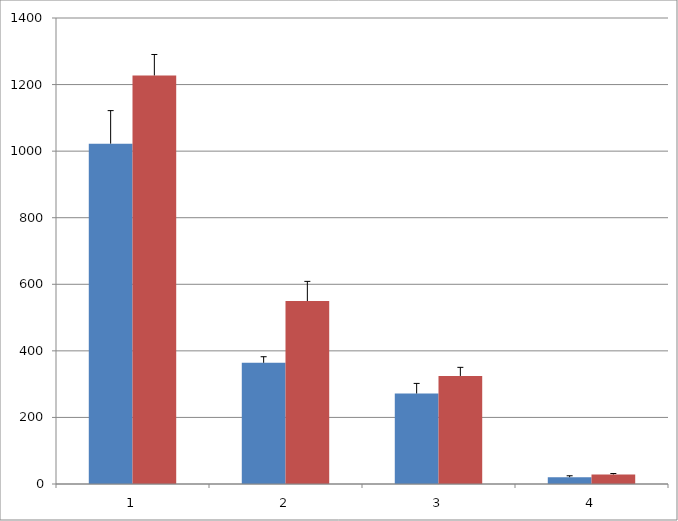
| Category | Series 0 | Series 1 |
|---|---|---|
| 0 | 1022.52 | 1227.485 |
| 1 | 364.091 | 549.69 |
| 2 | 271.852 | 324.626 |
| 3 | 20.379 | 28.753 |